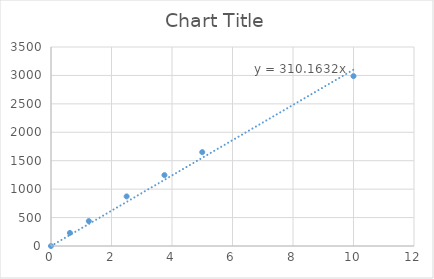
| Category | Series 0 |
|---|---|
| 0.0 | 0 |
| 0.625 | 230 |
| 1.25 | 438 |
| 2.5 | 872 |
| 3.75 | 1246.7 |
| 5.0 | 1651 |
| 10.0 | 2987.5 |